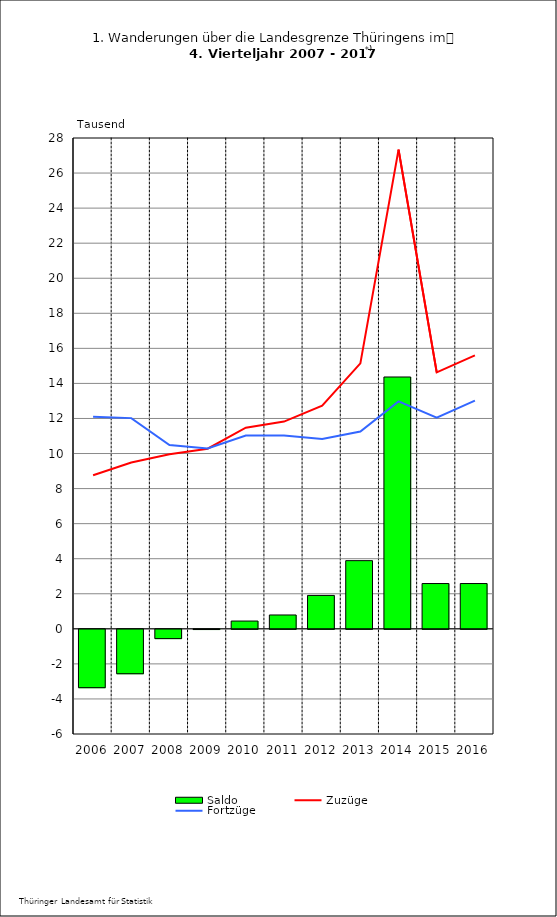
| Category | Saldo |
|---|---|
| 2006.0 | -3.329 |
| 2007.0 | -2.534 |
| 2008.0 | -0.53 |
| 2009.0 | -0.012 |
| 2010.0 | 0.443 |
| 2011.0 | 0.79 |
| 2012.0 | 1.906 |
| 2013.0 | 3.889 |
| 2014.0 | 14.366 |
| 2015.0 | 2.583 |
| 2016.0 | 2.583 |